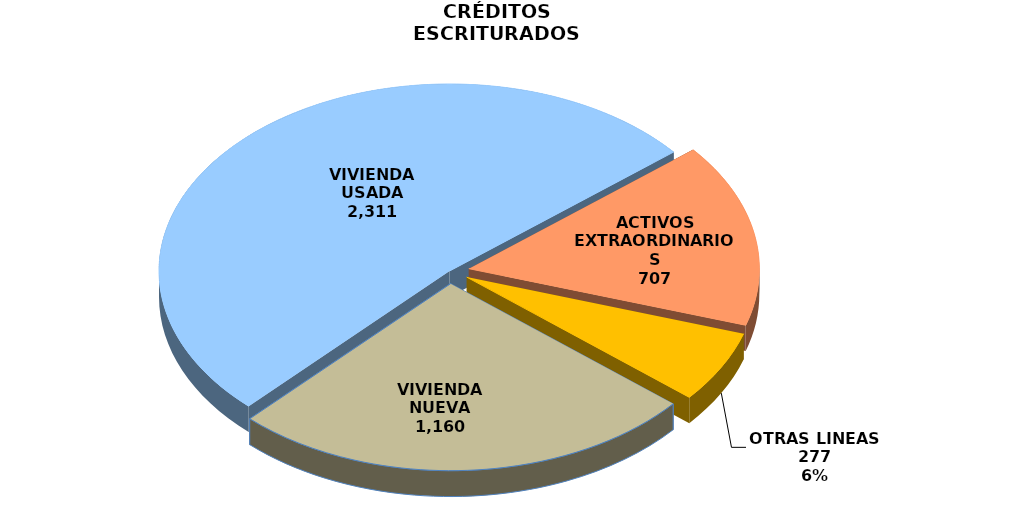
| Category | Series 0 |
|---|---|
| VIVIENDA NUEVA | 1160 |
| VIVIENDA USADA | 2311 |
| ACTIVOS EXTRAORDINARIOS | 707 |
| OTRAS LINEAS | 277 |